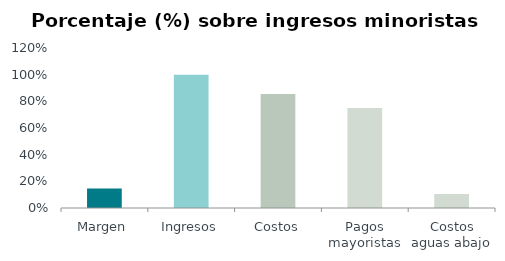
| Category | Series 0 |
|---|---|
| Margen | 0.146 |
| Ingresos | 1 |
| Costos | 0.854 |
| Pagos mayoristas | 0.75 |
| Costos aguas abajo | 0.104 |